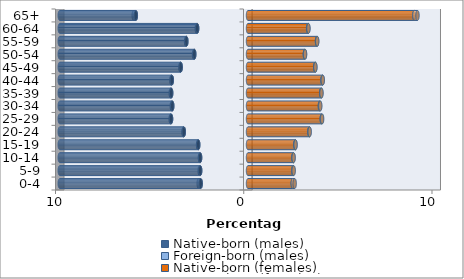
| Category | Native-born (males) | Foreign-born (males) | Native-born (females) | Foreign-born (females) |
|---|---|---|---|---|
| 0-4 | -2.513 | -0.108 | 2.379 | 0.102 |
| 5-9 | -2.54 | -0.03 | 2.4 | 0.028 |
| 10-14 | -2.544 | -0.01 | 2.411 | 0.01 |
| 15-19 | -2.643 | -0.01 | 2.515 | 0.01 |
| 20-24 | -3.41 | -0.017 | 3.259 | 0.017 |
| 25-29 | -4.087 | -0.023 | 3.918 | 0.02 |
| 30-34 | -4.024 | -0.026 | 3.82 | 0.02 |
| 35-39 | -4.08 | -0.025 | 3.887 | 0.017 |
| 40-44 | -4.046 | -0.027 | 3.957 | 0.015 |
| 45-49 | -3.575 | -0.017 | 3.571 | 0.009 |
| 50-54 | -2.854 | -0.015 | 3.023 | 0.009 |
| 55-59 | -3.274 | -0.015 | 3.666 | 0.011 |
| 60-64 | -2.7 | -0.021 | 3.192 | 0.022 |
| 65+ | -5.958 | -0.115 | 8.838 | 0.167 |